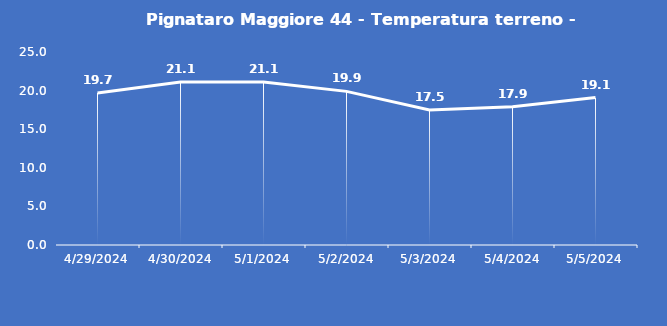
| Category | Pignataro Maggiore 44 - Temperatura terreno - Grezzo (°C) |
|---|---|
| 4/29/24 | 19.7 |
| 4/30/24 | 21.1 |
| 5/1/24 | 21.1 |
| 5/2/24 | 19.9 |
| 5/3/24 | 17.5 |
| 5/4/24 | 17.9 |
| 5/5/24 | 19.1 |